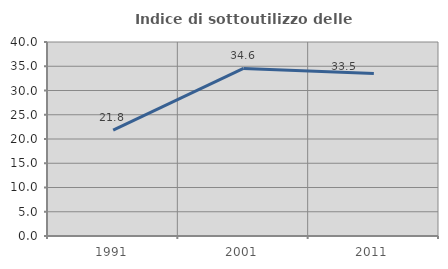
| Category | Indice di sottoutilizzo delle abitazioni  |
|---|---|
| 1991.0 | 21.809 |
| 2001.0 | 34.561 |
| 2011.0 | 33.501 |